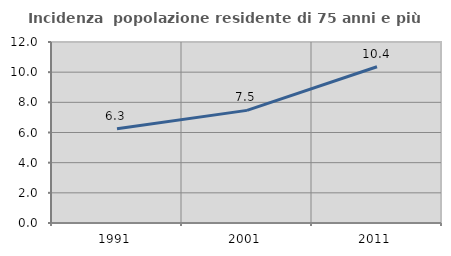
| Category | Incidenza  popolazione residente di 75 anni e più |
|---|---|
| 1991.0 | 6.25 |
| 2001.0 | 7.467 |
| 2011.0 | 10.358 |